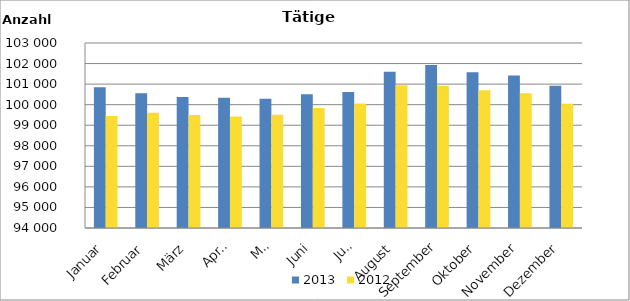
| Category | 2013 | 2012 |
|---|---|---|
| Januar | 100847 | 99454 |
| Februar | 100553 | 99602 |
| März | 100368 | 99492 |
| April | 100333 | 99428 |
| Mai | 100283 | 99514 |
| Juni | 100509 | 99842 |
| Juli | 100613 | 100062 |
| August | 101603 | 100946 |
| September | 101933 | 100924 |
| Oktober | 101583 | 100697 |
| November | 101415 | 100560 |
| Dezember | 100923 | 100040 |